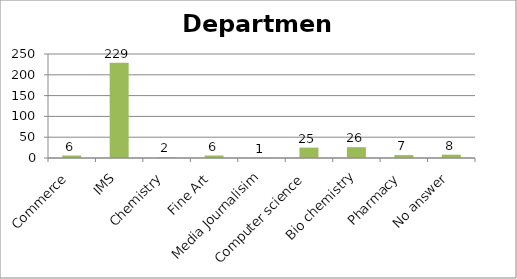
| Category | Department |
|---|---|
| Commerce | 6 |
| IMS | 229 |
| Chemistry | 2 |
| Fine Art | 6 |
| Media Journalisim | 1 |
| Computer science | 25 |
| Bio chemistry | 26 |
| Pharmacy | 7 |
| No answer | 8 |